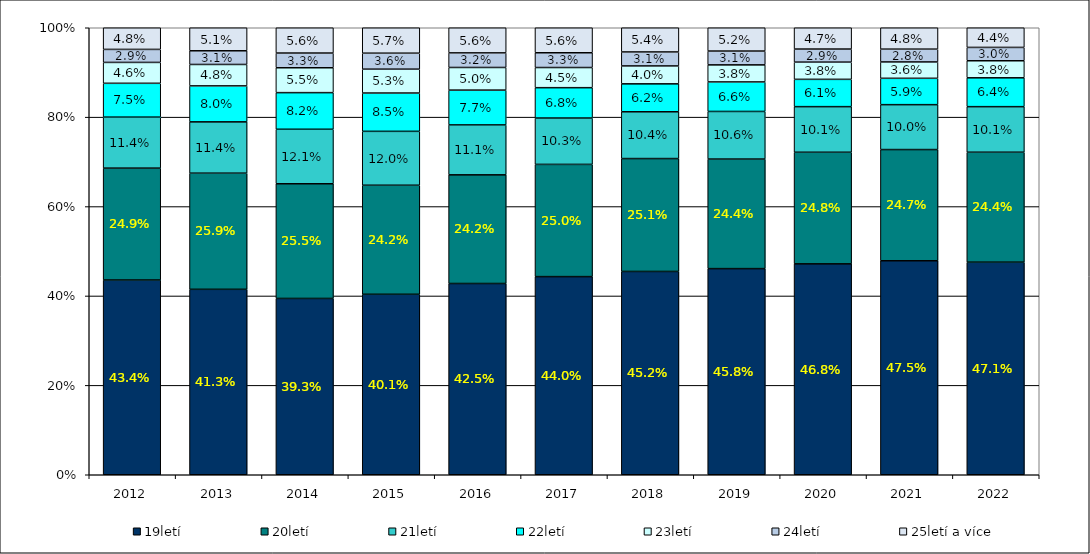
| Category | 19letí | 20letí | 21letí | 22letí | 23letí | 24letí | 25letí a více |
|---|---|---|---|---|---|---|---|
| 2012.0 | 0.434 | 0.249 | 0.114 | 0.075 | 0.046 | 0.029 | 0.048 |
| 2013.0 | 0.413 | 0.259 | 0.114 | 0.08 | 0.048 | 0.031 | 0.051 |
| 2014.0 | 0.393 | 0.255 | 0.121 | 0.082 | 0.055 | 0.033 | 0.056 |
| 2015.0 | 0.401 | 0.242 | 0.12 | 0.085 | 0.053 | 0.036 | 0.056 |
| 2016.0 | 0.425 | 0.242 | 0.111 | 0.077 | 0.05 | 0.032 | 0.056 |
| 2017.0 | 0.44 | 0.25 | 0.103 | 0.068 | 0.045 | 0.033 | 0.056 |
| 2018.0 | 0.452 | 0.251 | 0.104 | 0.062 | 0.04 | 0.031 | 0.054 |
| 2019.0 | 0.458 | 0.244 | 0.106 | 0.066 | 0.038 | 0.031 | 0.052 |
| 2020.0 | 0.468 | 0.248 | 0.101 | 0.061 | 0.038 | 0.029 | 0.047 |
| 2021.0 | 0.475 | 0.247 | 0.1 | 0.058 | 0.036 | 0.028 | 0.048 |
| 2022.0 | 0.471 | 0.244 | 0.101 | 0.064 | 0.038 | 0.03 | 0.044 |